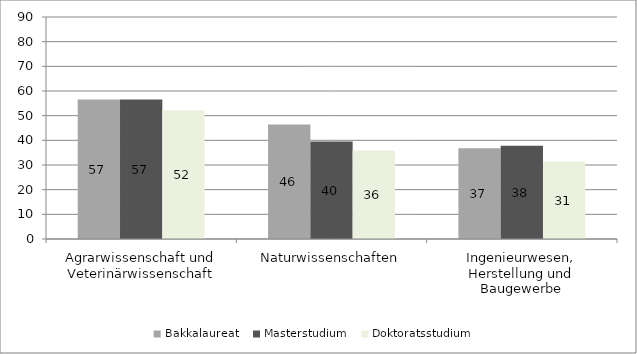
| Category | Bakkalaureat  | Masterstudium  | Doktoratsstudium  |
|---|---|---|---|
| Agrarwissenschaft und Veterinärwissenschaft | 56.545 | 56.589 | 52.174 |
| Naturwissenschaften | 46.437 | 39.552 | 35.924 |
| Ingenieurwesen, Herstellung und Baugewerbe | 36.777 | 37.843 | 31.415 |